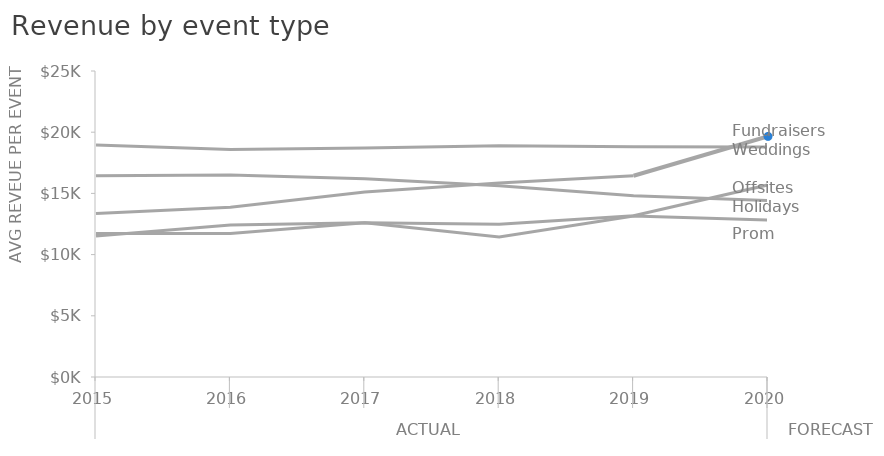
| Category | Prom | Offsite | Wedding | Holiday | Fundraiser |
|---|---|---|---|---|---|
| 0 | 11.718 | 11.529 | 18.963 | 16.443 | 13.356 |
| 1 | 11.718 | 12.411 | 18.585 | 16.506 | 13.86 |
| 2 | 12.6 | 12.6 | 18.711 | 16.191 | 15.12 |
| 3 | 11.445 | 12.485 | 18.9 | 15.624 | 15.847 |
| 4 | 13.162 | 13.167 | 18.814 | 14.805 | 16.443 |
| 5 | 12.818 | 15.696 | 18.8 | 14.427 | 19.656 |